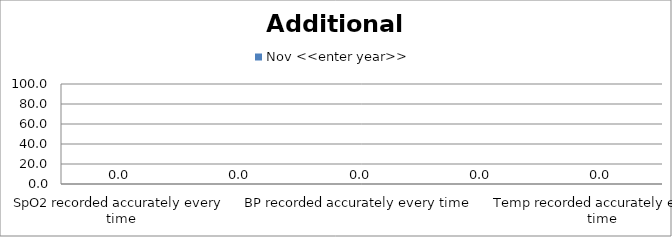
| Category | Nov <<enter year>> |
|---|---|
| SpO2 recorded accurately every time | 0 |
| CRT recorded accurately every time | 0 |
| BP recorded accurately every time | 0 |
| Skin Colour recorded accurately every time | 0 |
| Temp recorded accurately every time | 0 |